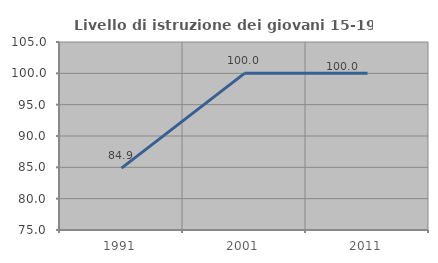
| Category | Livello di istruzione dei giovani 15-19 anni |
|---|---|
| 1991.0 | 84.874 |
| 2001.0 | 100 |
| 2011.0 | 100 |